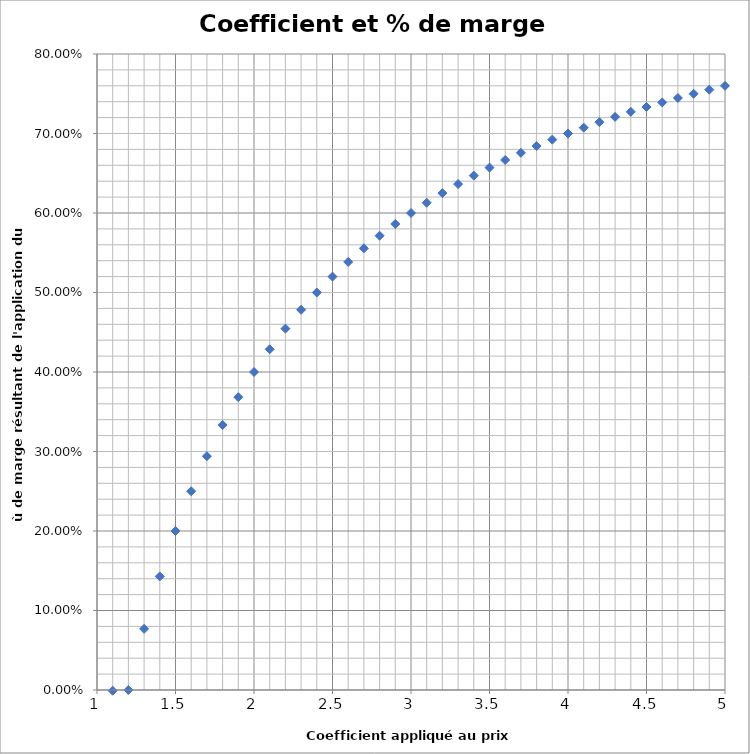
| Category | Series 0 |
|---|---|
| 1.1 | -0.001 |
| 1.2 | 0 |
| 1.3 | 0.077 |
| 1.4 | 0.143 |
| 1.5 | 0.2 |
| 1.6 | 0.25 |
| 1.700000000000001 | 0.294 |
| 1.800000000000001 | 0.333 |
| 1.900000000000001 | 0.368 |
| 2.000000000000001 | 0.4 |
| 2.100000000000001 | 0.429 |
| 2.200000000000001 | 0.455 |
| 2.300000000000001 | 0.478 |
| 2.400000000000001 | 0.5 |
| 2.500000000000001 | 0.52 |
| 2.600000000000001 | 0.538 |
| 2.700000000000001 | 0.556 |
| 2.800000000000002 | 0.571 |
| 2.900000000000002 | 0.586 |
| 3.000000000000002 | 0.6 |
| 3.100000000000002 | 0.613 |
| 3.200000000000002 | 0.625 |
| 3.300000000000002 | 0.636 |
| 3.400000000000002 | 0.647 |
| 3.500000000000002 | 0.657 |
| 3.600000000000002 | 0.667 |
| 3.700000000000002 | 0.676 |
| 3.800000000000002 | 0.684 |
| 3.900000000000003 | 0.692 |
| 4.000000000000003 | 0.7 |
| 4.100000000000002 | 0.707 |
| 4.200000000000002 | 0.714 |
| 4.300000000000002 | 0.721 |
| 4.400000000000001 | 0.727 |
| 4.500000000000001 | 0.733 |
| 4.6 | 0.739 |
| 4.7 | 0.745 |
| 4.8 | 0.75 |
| 4.899999999999999 | 0.755 |
| 5.0 | 0.76 |